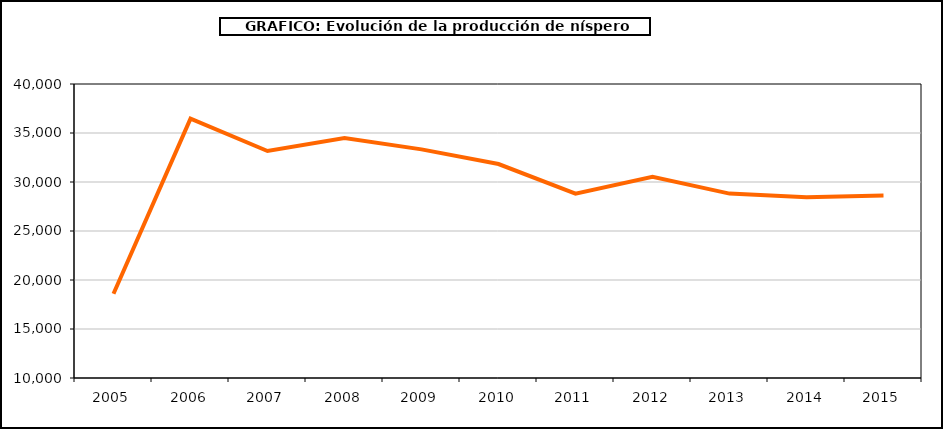
| Category | producción níspero |
|---|---|
| 2005.0 | 18597 |
| 2006.0 | 36467 |
| 2007.0 | 33158 |
| 2008.0 | 34484 |
| 2009.0 | 33328 |
| 2010.0 | 31834 |
| 2011.0 | 28812 |
| 2012.0 | 30529 |
| 2013.0 | 28815 |
| 2014.0 | 28449 |
| 2015.0 | 28620 |